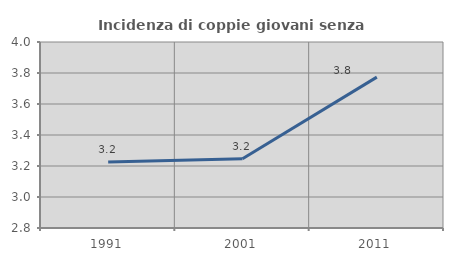
| Category | Incidenza di coppie giovani senza figli |
|---|---|
| 1991.0 | 3.226 |
| 2001.0 | 3.247 |
| 2011.0 | 3.774 |